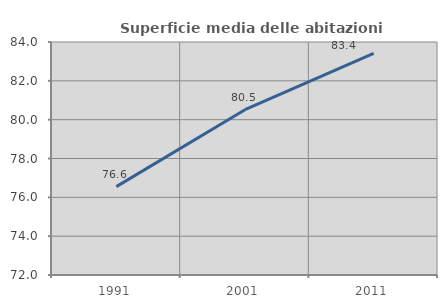
| Category | Superficie media delle abitazioni occupate |
|---|---|
| 1991.0 | 76.551 |
| 2001.0 | 80.511 |
| 2011.0 | 83.408 |